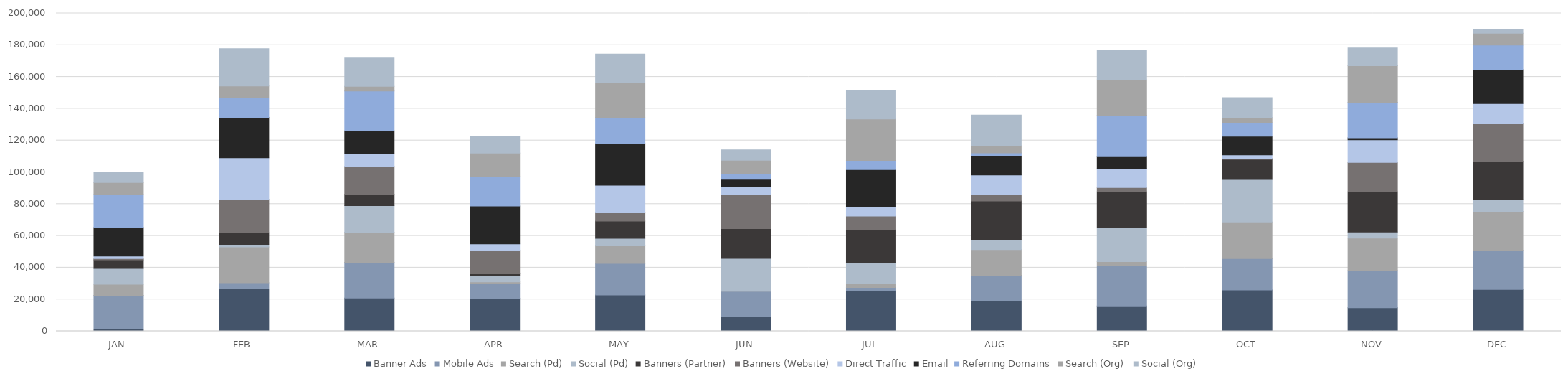
| Category | Banner Ads | Mobile Ads | Search (Pd) | Social (Pd) | Banners (Partner) | Banners (Website) | Direct Traffic | Email | Referring Domains | Search (Org) | Social (Org) |
|---|---|---|---|---|---|---|---|---|---|---|---|
| JAN | 1304 | 21285 | 7020 | 9874 | 5409 | 831 | 1569 | 17983 | 20676 | 7567 | 6614 |
| FEB | 26663 | 3842 | 22565 | 1275 | 7643 | 21131 | 25969 | 25468 | 12180 | 7510 | 23484 |
| MAR | 20824 | 22524 | 19001 | 16686 | 7137 | 17561 | 7886 | 14424 | 25103 | 2970 | 17822 |
| APR | 20615 | 9473 | 901 | 3846 | 1336 | 14747 | 4104 | 23807 | 18425 | 14772 | 10778 |
| MAY | 22808 | 19812 | 11112 | 4705 | 10817 | 5210 | 17398 | 26181 | 16306 | 21839 | 18216 |
| JUN | 9443 | 15751 | 31 | 20554 | 18751 | 21365 | 4916 | 4797 | 3388 | 8541 | 6592 |
| JUL | 25562 | 1999 | 2271 | 13476 | 20593 | 8576 | 6127 | 23145 | 5742 | 26009 | 18140 |
| AUG | 19129 | 16082 | 16151 | 6255 | 24271 | 3941 | 12493 | 12005 | 1883 | 4512 | 19304 |
| SEP | 15939 | 25148 | 2728 | 21165 | 22709 | 2712 | 12134 | 7310 | 25974 | 22258 | 18692 |
| OCT | 25976 | 19790 | 22990 | 26770 | 12616 | 625 | 2190 | 11778 | 8458 | 3177 | 12592 |
| NOV | 14829 | 23346 | 20374 | 3887 | 25314 | 18480 | 14209 | 1234 | 22349 | 23035 | 11167 |
| DEC | 26346 | 24571 | 24490 | 7493 | 23966 | 23604 | 12766 | 21274 | 15556 | 7434 | 2517 |